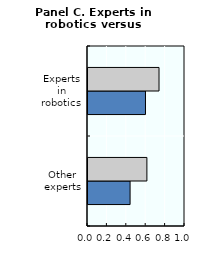
| Category | physical | reasoning/language |
|---|---|---|
| Other experts | 0.434 | 0.607 |
| Experts in robotics | 0.593 | 0.732 |